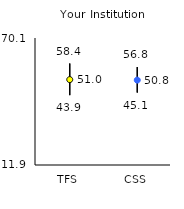
| Category | 25th | 75th | Mean |
|---|---|---|---|
| TFS | 43.9 | 58.4 | 51.03 |
| CSS | 45.1 | 56.8 | 50.8 |